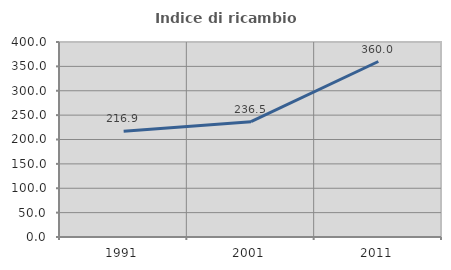
| Category | Indice di ricambio occupazionale  |
|---|---|
| 1991.0 | 216.949 |
| 2001.0 | 236.508 |
| 2011.0 | 360 |